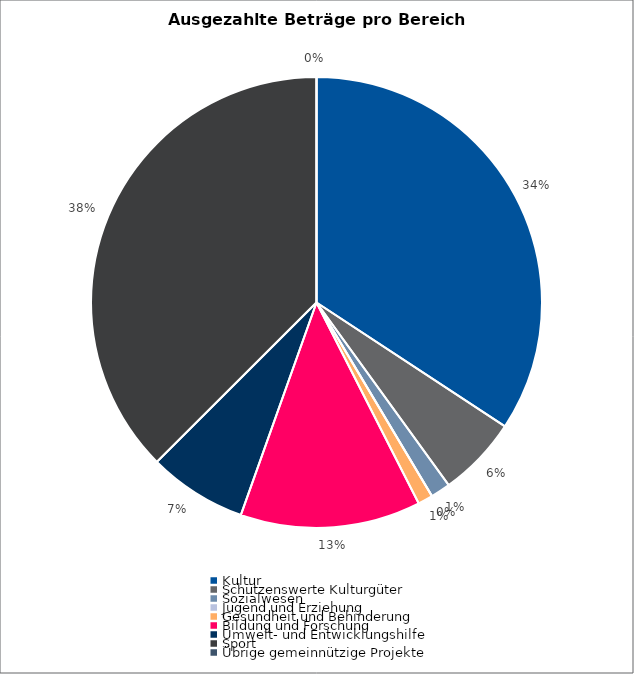
| Category | Series 0 |
|---|---|
| Kultur | 726841 |
| Schützenswerte Kulturgüter | 122532 |
| Sozialwesen | 29967 |
| Jugend und Erziehung | 0 |
| Gesundheit und Behinderung | 22678 |
| Bildung und Forschung | 274425 |
| Umwelt- und Entwicklungshilfe | 150000 |
| Sport | 795555 |
| Übrige gemeinnützige Projekte | 0 |